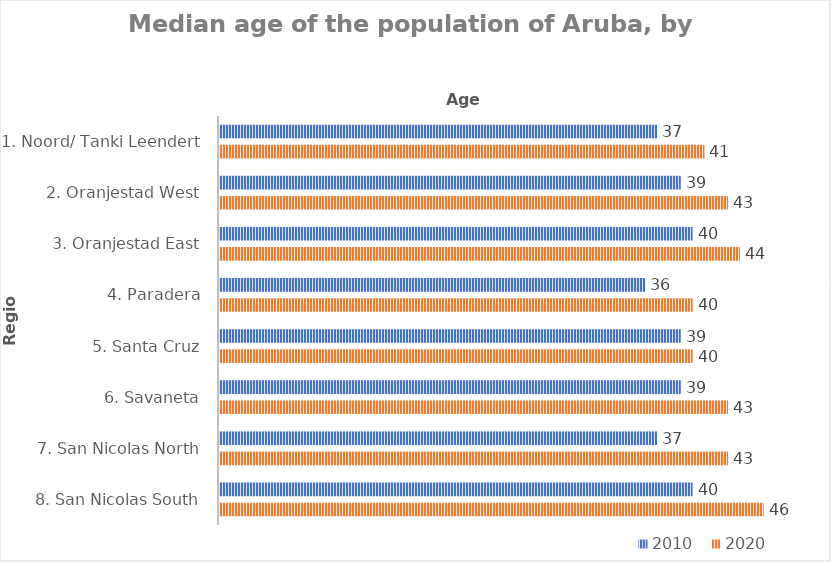
| Category | 2010 | 2020 |
|---|---|---|
| 1. Noord/ Tanki Leendert | 37 | 41 |
| 2. Oranjestad West | 39 | 43 |
| 3. Oranjestad East | 40 | 44 |
| 4. Paradera | 36 | 40 |
| 5. Santa Cruz | 39 | 40 |
| 6. Savaneta | 39 | 43 |
| 7. San Nicolas North | 37 | 43 |
| 8. San Nicolas South | 40 | 46 |